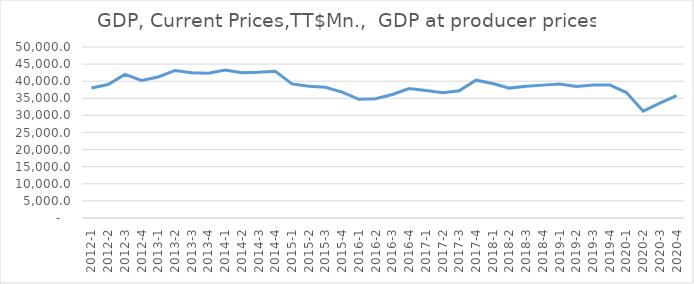
| Category | GDP at producer prices |
|---|---|
| 2012-1 | 38008.92 |
| 2012-2 | 39037.828 |
| 2012-3 | 41976.535 |
| 2012-4 | 40210.407 |
| 2013-1 | 41236.795 |
| 2013-2 | 43144.265 |
| 2013-3 | 42489.161 |
| 2013-4 | 42307.827 |
| 2014-1 | 43270.092 |
| 2014-2 | 42483.818 |
| 2014-3 | 42612.699 |
| 2014-4 | 42917.786 |
| 2015-1 | 39200.139 |
| 2015-2 | 38552.514 |
| 2015-3 | 38229.185 |
| 2015-4 | 36795.591 |
| 2016-1 | 34695.372 |
| 2016-2 | 34868.62 |
| 2016-3 | 36125.136 |
| 2016-4 | 37850.136 |
| 2017-1 | 37248.031 |
| 2017-2 | 36648.321 |
| 2017-3 | 37219.989 |
| 2017-4 | 40297.11 |
| 2018-1 | 39342.329 |
| 2018-2 | 37981.291 |
| 2018-3 | 38532.099 |
| 2018-4 | 38852.567 |
| 2019-1 | 39153.011 |
| 2019-2 | 38420.71 |
| 2019-3 | 38895.743 |
| 2019-4 | 38918.253 |
| 2020-1 | 36675.9 |
| 2020-2 | 31239.285 |
| 2020-3 | 33575.411 |
| 2020-4 | 35786.564 |